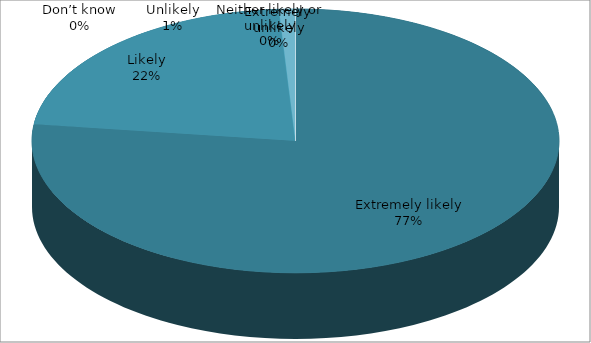
| Category | April | May | June |
|---|---|---|---|
| Extremely likely | 77 | 68 | 81 |
| Likely | 22 | 31 | 18 |
| Neither likely or unlikely | 0 | 1 | 1 |
| Unlikely | 1 | 0 | 0 |
| Extremely unlikely | 0 | 0 | 0 |
| Don’t know | 0 | 0 | 0 |